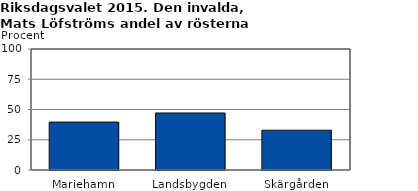
| Category | Series 0 |
|---|---|
| Mariehamn | 39.601 |
| Landsbygden | 47.125 |
| Skärgården | 32.868 |